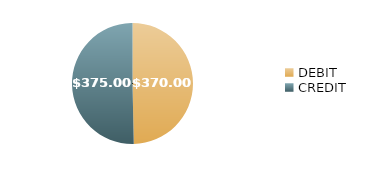
| Category | $370.00 $375.00 |
|---|---|
| DEBIT | 370 |
| CREDIT | 375 |